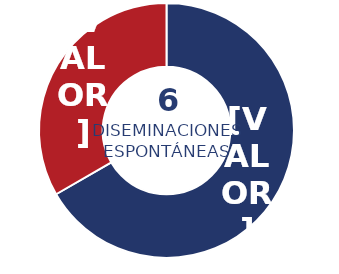
| Category | Series 0 |
|---|---|
| Física | 4 |
| Jurídica | 2 |